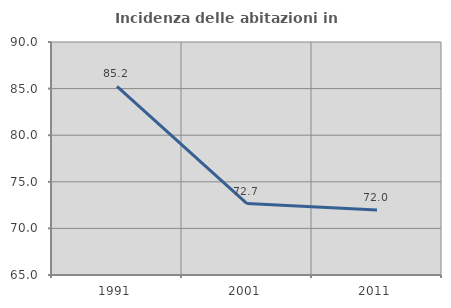
| Category | Incidenza delle abitazioni in proprietà  |
|---|---|
| 1991.0 | 85.246 |
| 2001.0 | 72.667 |
| 2011.0 | 71.975 |